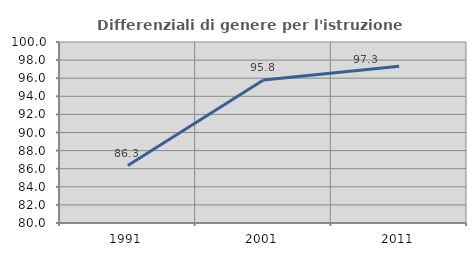
| Category | Differenziali di genere per l'istruzione superiore |
|---|---|
| 1991.0 | 86.349 |
| 2001.0 | 95.808 |
| 2011.0 | 97.31 |